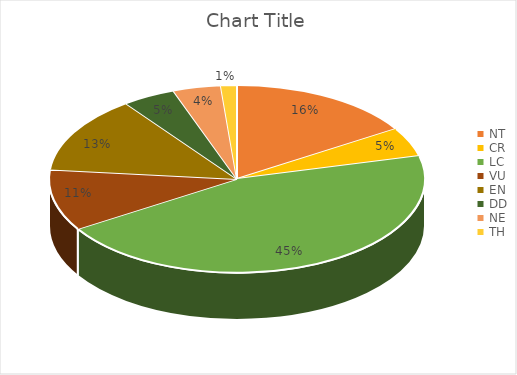
| Category | Series 0 |
|---|---|
| NT | 35 |
| CR | 11 |
| LC | 98 |
| VU | 23 |
| EN | 29 |
| DD | 10 |
| NE | 9 |
| TH | 3 |